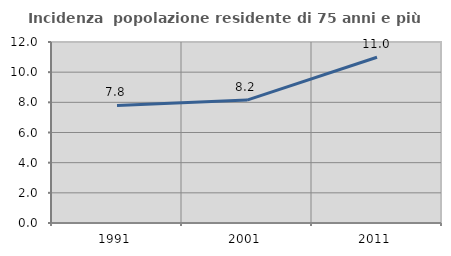
| Category | Incidenza  popolazione residente di 75 anni e più |
|---|---|
| 1991.0 | 7.792 |
| 2001.0 | 8.15 |
| 2011.0 | 10.992 |